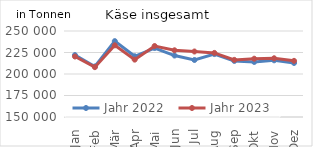
| Category | Jahr 2022 | Jahr 2023 |
|---|---|---|
| Jan | 222013.872 | 220318.011 |
| Feb | 208782.862 | 207970.009 |
| Mär | 238206.921 | 233340.692 |
| Apr | 220624.611 | 216701.772 |
| Mai | 230212.191 | 232531.109 |
| Jun | 221466.593 | 227567.189 |
| Jul | 216294.353 | 226165.27 |
| Aug | 223173.206 | 224523.748 |
| Sep | 215195.612 | 216418.291 |
| Okt | 214003.415 | 217770.374 |
| Nov | 215927.597 | 218290.57 |
| Dez | 212824.655 | 215283.476 |